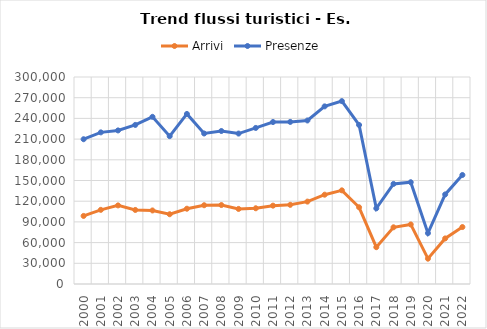
| Category | Arrivi | Presenze |
|---|---|---|
| 2000.0 | 98643 | 209816 |
| 2001.0 | 107476 | 219754 |
| 2002.0 | 113911 | 222577 |
| 2003.0 | 107332 | 230548 |
| 2004.0 | 106595 | 242274 |
| 2005.0 | 101119 | 214230 |
| 2006.0 | 109100 | 246456 |
| 2007.0 | 114151 | 218127 |
| 2008.0 | 114437 | 221725 |
| 2009.0 | 108787 | 218034 |
| 2010.0 | 109762 | 226186 |
| 2011.0 | 113559 | 234740 |
| 2012.0 | 114757 | 234911 |
| 2013.0 | 119417 | 237005 |
| 2014.0 | 129442 | 257433 |
| 2015.0 | 135739 | 265042 |
| 2016.0 | 111177 | 230456 |
| 2017.0 | 53364 | 109619 |
| 2018.0 | 82173 | 145066 |
| 2019.0 | 86317 | 147496 |
| 2020.0 | 36707 | 73674 |
| 2021.0 | 66034 | 129805 |
| 2022.0 | 82541 | 157984 |